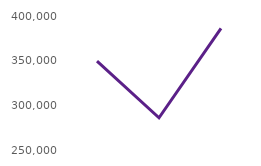
| Category | Users accessing the website |
|---|---|
| Nov23 | 349382 |
| Dec23 | 286118 |
| Jan24 | 386123 |